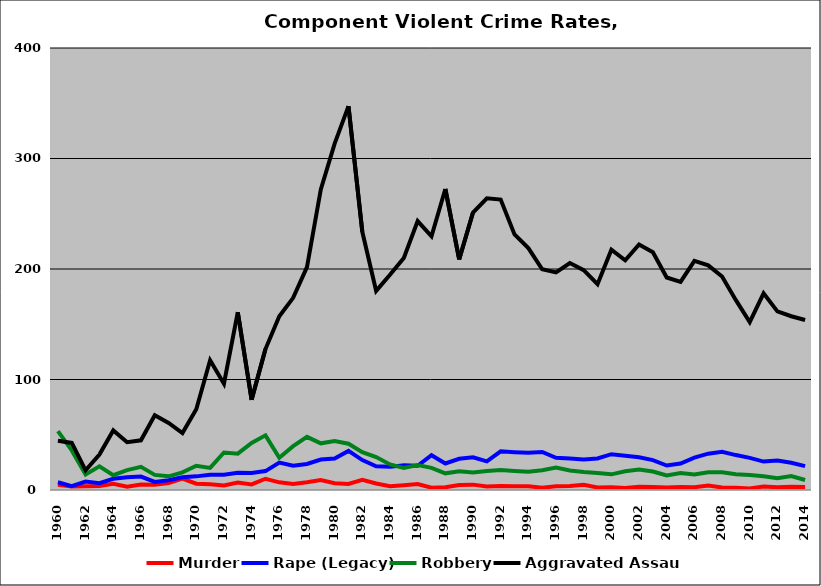
| Category | Murder | Rape (Legacy) | Robbery | Aggravated Assault |
|---|---|---|---|---|
| 1960.0 | 4.848 | 6.968 | 53.323 | 44.537 |
| 1961.0 | 3.254 | 3.55 | 35.799 | 42.604 |
| 1962.0 | 3.288 | 7.671 | 13.973 | 17.808 |
| 1963.0 | 3.561 | 6.231 | 21.365 | 32.047 |
| 1964.0 | 5.539 | 10.204 | 13.411 | 53.936 |
| 1965.0 | 2.941 | 11.471 | 17.941 | 43.235 |
| 1966.0 | 4.863 | 12.158 | 20.973 | 44.985 |
| 1967.0 | 4.762 | 7.302 | 13.651 | 67.619 |
| 1968.0 | 6.349 | 8.889 | 12.381 | 60.635 |
| 1969.0 | 10.312 | 11.562 | 15.938 | 51.562 |
| 1970.0 | 5.716 | 12.334 | 21.96 | 73.101 |
| 1971.0 | 5.294 | 13.824 | 20 | 117.353 |
| 1972.0 | 4.058 | 13.913 | 33.913 | 96.232 |
| 1973.0 | 6.799 | 15.581 | 32.861 | 160.907 |
| 1974.0 | 5.014 | 15.32 | 42.618 | 81.616 |
| 1975.0 | 10.16 | 17.112 | 49.465 | 127.54 |
| 1976.0 | 6.923 | 24.872 | 29.231 | 157.179 |
| 1977.0 | 5.419 | 21.921 | 39.655 | 173.892 |
| 1978.0 | 7.075 | 23.585 | 48.113 | 201.651 |
| 1979.0 | 9.111 | 27.556 | 42.222 | 272 |
| 1980.0 | 6.184 | 28.574 | 44.354 | 313.464 |
| 1981.0 | 5.488 | 35.366 | 41.87 | 347.358 |
| 1982.0 | 9.163 | 27.092 | 34.263 | 233.665 |
| 1983.0 | 5.837 | 21.401 | 29.767 | 180.156 |
| 1984.0 | 3.327 | 20.939 | 23.092 | 194.716 |
| 1985.0 | 4.322 | 22.397 | 20.039 | 210.02 |
| 1986.0 | 5.325 | 21.893 | 22.485 | 243.393 |
| 1987.0 | 2.041 | 31.429 | 20 | 229.592 |
| 1988.0 | 2.548 | 23.992 | 15.074 | 272.399 |
| 1989.0 | 4.421 | 28.211 | 17.053 | 208.632 |
| 1990.0 | 4.85 | 29.542 | 15.873 | 251.109 |
| 1991.0 | 3.261 | 25.87 | 17.174 | 263.913 |
| 1992.0 | 3.648 | 34.979 | 18.026 | 262.876 |
| 1993.0 | 3.404 | 34.255 | 17.234 | 231.277 |
| 1994.0 | 3.361 | 33.613 | 16.597 | 218.908 |
| 1995.0 | 2.083 | 34.375 | 17.917 | 199.792 |
| 1996.0 | 3.326 | 29.106 | 20.374 | 196.881 |
| 1997.0 | 3.542 | 28.542 | 17.708 | 205.417 |
| 1998.0 | 4.782 | 27.651 | 16.216 | 198.96 |
| 1999.0 | 2.294 | 28.565 | 15.429 | 186.196 |
| 2000.0 | 2.43 | 32.403 | 14.176 | 217.505 |
| 2001.0 | 1.823 | 30.987 | 17.013 | 207.796 |
| 2002.0 | 3.007 | 29.669 | 18.644 | 222.12 |
| 2003.0 | 2.788 | 27.086 | 16.729 | 215.092 |
| 2004.0 | 2.174 | 22.139 | 13.244 | 192.335 |
| 2005.0 | 2.752 | 23.978 | 15.33 | 188.287 |
| 2006.0 | 2.524 | 29.32 | 13.98 | 207.377 |
| 2007.0 | 4.017 | 32.898 | 16.066 | 203.317 |
| 2008.0 | 2.251 | 34.523 | 16.136 | 193.253 |
| 2009.0 | 2.021 | 31.602 | 14.331 | 171.79 |
| 2010.0 | 1.419 | 29.097 | 13.484 | 151.874 |
| 2011.0 | 3.173 | 25.733 | 12.514 | 178.019 |
| 2012.0 | 2.428 | 26.707 | 10.579 | 161.63 |
| 2013.0 | 2.915 | 24.69 | 12.688 | 157.23 |
| 2014.0 | 2.739 | 21.57 | 9.073 | 153.898 |